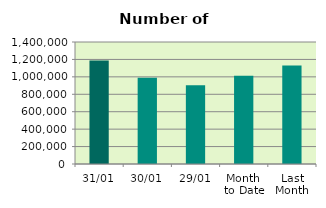
| Category | Series 0 |
|---|---|
| 31/01 | 1188436 |
| 30/01 | 988508 |
| 29/01 | 903676 |
| Month 
to Date | 1012702.182 |
| Last
Month | 1131500.526 |